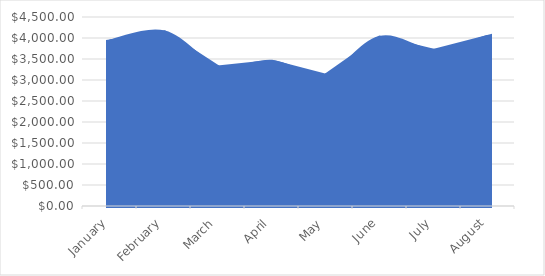
| Category | January |
|---|---|
| 0 | 3870 |
| 1 | 4087 |
| 2 | 3248 |
| 3 | 3383 |
| 4 | 3052 |
| 5 | 3954 |
| 6 | 3644 |
| 7 | 3977 |